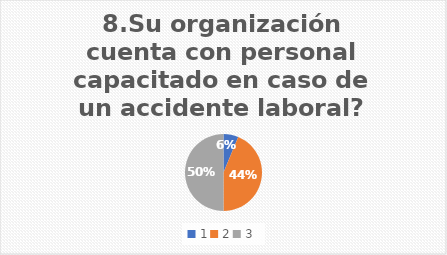
| Category | Su organización cuenta con personal capacitado en caso de un accidente laboral? |
|---|---|
| 0 | 6.25 |
| 1 | 43.75 |
| 2 | 50 |